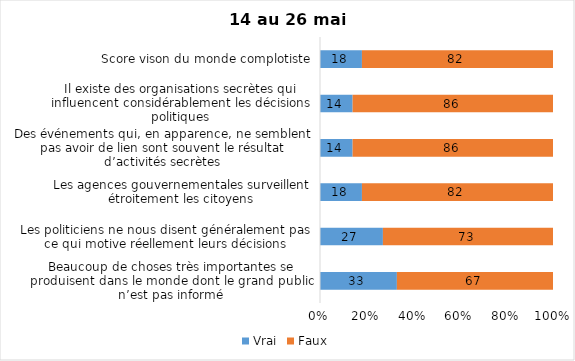
| Category | Vrai | Faux |
|---|---|---|
| Beaucoup de choses très importantes se produisent dans le monde dont le grand public n’est pas informé | 33 | 67 |
| Les politiciens ne nous disent généralement pas ce qui motive réellement leurs décisions | 27 | 73 |
| Les agences gouvernementales surveillent étroitement les citoyens | 18 | 82 |
| Des événements qui, en apparence, ne semblent pas avoir de lien sont souvent le résultat d’activités secrètes | 14 | 86 |
| Il existe des organisations secrètes qui influencent considérablement les décisions politiques | 14 | 86 |
| Score vison du monde complotiste | 18 | 82 |